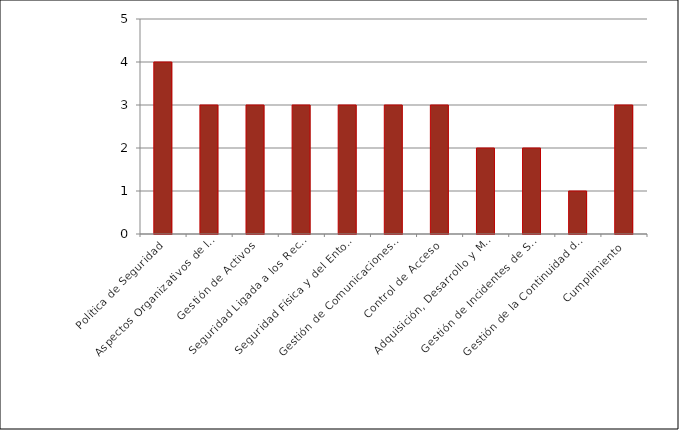
| Category | Nivel de Madurez (CMM) |
|---|---|
| Política de Seguridad | 4 |
| Aspectos Organizativos de la Seguridad de la Información | 3 |
| Gestión de Activos | 3 |
| Seguridad Ligada a los Recursos Humanos | 3 |
| Seguridad Física y del Entorno | 3 |
| Gestión de Comunicaciones y Operaciones | 3 |
| Control de Acceso | 3 |
| Adquisición, Desarrollo y Mantenimiento de Sistemas de Información | 2 |
| Gestión de Incidentes de Seguridad de la Información | 2 |
| Gestión de la Continuidad del Negocio | 1 |
| Cumplimiento | 3 |